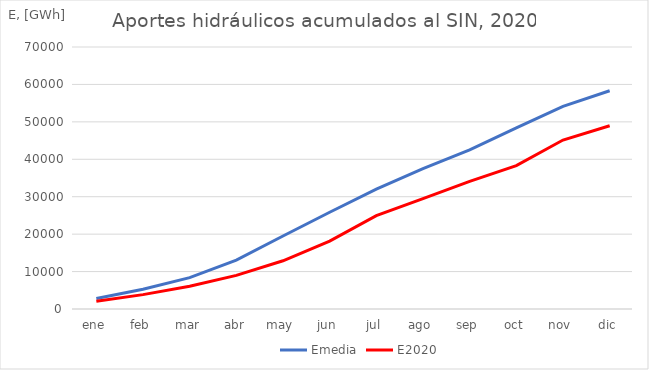
| Category | Emedia | E2020 |
|---|---|---|
| ene | 2814.8 | 2047.86 |
| feb | 5284.15 | 3838.32 |
| mar | 8379.5 | 6089.54 |
| abr | 13043 | 8989.34 |
| may | 19515.18 | 12886.04 |
| jun | 25847.28 | 18159.74 |
| jul | 32050.69 | 24955.25 |
| ago | 37529.94 | 29490.55 |
| sep | 42516.84 | 34118.95 |
| oct | 48392.27 | 38321 |
| nov | 54161.57 | 45148.1 |
| dic | 58314.33 | 48970.09 |